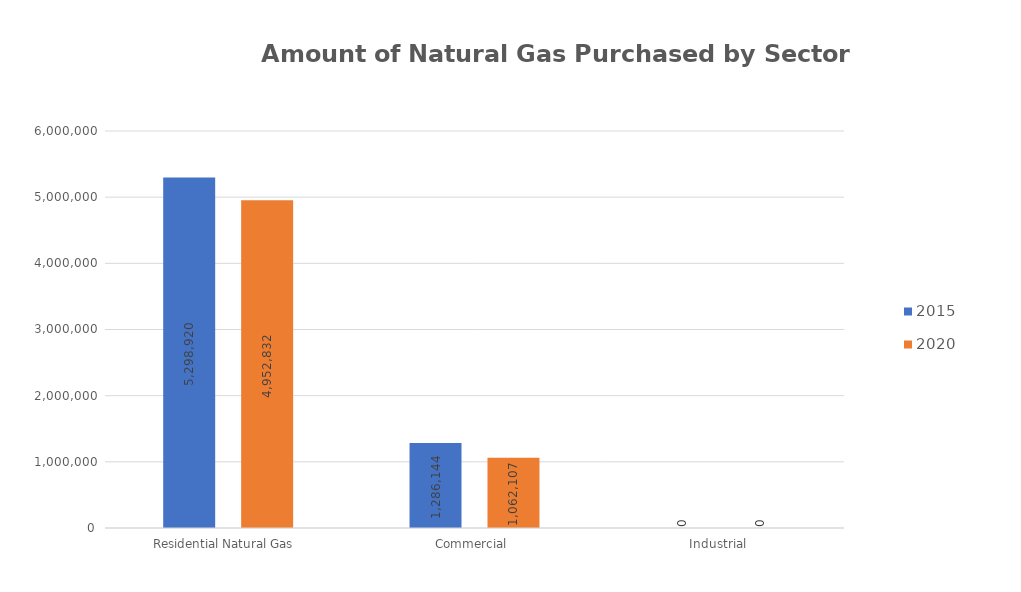
| Category | 2015 | 2020 |
|---|---|---|
| Residential Natural Gas  | 5298920 | 4952832 |
| Commercial  | 1286144 | 1062107 |
| Industrial  | 0 | 0 |